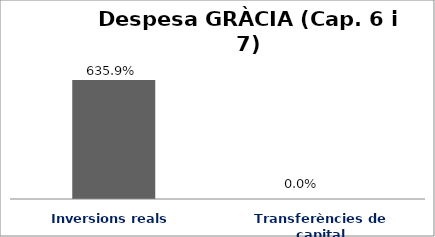
| Category | Series 0 |
|---|---|
| Inversions reals | 6.359 |
| Transferències de capital | 0 |